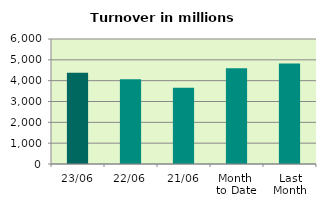
| Category | Series 0 |
|---|---|
| 23/06 | 4378.563 |
| 22/06 | 4067.171 |
| 21/06 | 3656.19 |
| Month 
to Date | 4595.429 |
| Last
Month | 4818.103 |